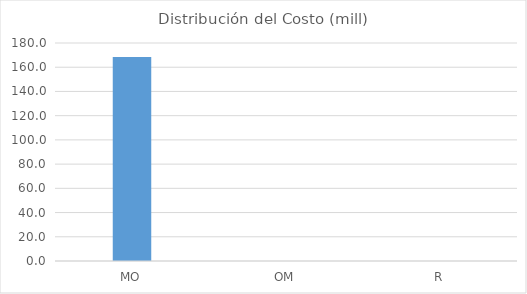
| Category | Series 0 |
|---|---|
| MO | 168.38 |
| OM | 0 |
| R | 0 |